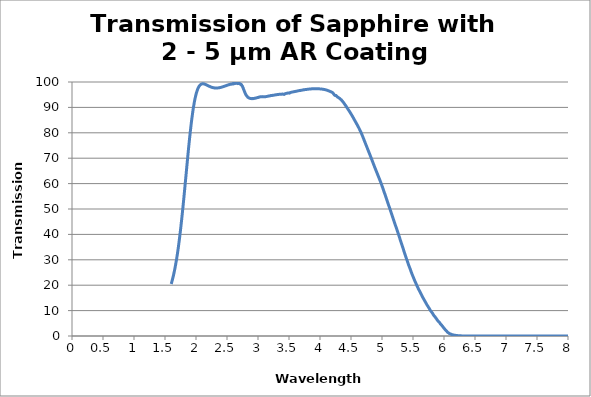
| Category | Series 0 |
|---|---|
| 1.59996 | 20.488 |
| 1.60243 | 20.683 |
| 1.6049 | 20.863 |
| 1.60737 | 21.093 |
| 1.6098299999999999 | 21.309 |
| 1.6122999999999998 | 21.516 |
| 1.61477 | 21.761 |
| 1.61724 | 21.986 |
| 1.61971 | 22.235 |
| 1.62218 | 22.436 |
| 1.6246500000000001 | 22.682 |
| 1.62712 | 22.929 |
| 1.6295899999999999 | 23.169 |
| 1.6320599999999998 | 23.408 |
| 1.63453 | 23.669 |
| 1.63699 | 23.946 |
| 1.6394600000000001 | 24.188 |
| 1.6419300000000001 | 24.481 |
| 1.6444 | 24.746 |
| 1.6468699999999998 | 25.047 |
| 1.64934 | 25.324 |
| 1.65181 | 25.603 |
| 1.65428 | 25.899 |
| 1.65675 | 26.192 |
| 1.65922 | 26.498 |
| 1.6616900000000001 | 26.842 |
| 1.66415 | 27.153 |
| 1.66662 | 27.469 |
| 1.66909 | 27.793 |
| 1.67156 | 28.134 |
| 1.67403 | 28.456 |
| 1.6765 | 28.811 |
| 1.67897 | 29.163 |
| 1.68144 | 29.519 |
| 1.68391 | 29.858 |
| 1.6863800000000002 | 30.214 |
| 1.68884 | 30.585 |
| 1.6913099999999999 | 30.97 |
| 1.69378 | 31.356 |
| 1.69625 | 31.742 |
| 1.69872 | 32.131 |
| 1.70119 | 32.531 |
| 1.7036600000000002 | 32.925 |
| 1.7061300000000001 | 33.328 |
| 1.7086 | 33.74 |
| 1.7110699999999999 | 34.159 |
| 1.71354 | 34.612 |
| 1.716 | 35.07 |
| 1.71847 | 35.521 |
| 1.7209400000000001 | 35.978 |
| 1.72341 | 36.444 |
| 1.72588 | 36.91 |
| 1.7283499999999998 | 37.38 |
| 1.73082 | 37.848 |
| 1.73329 | 38.338 |
| 1.73576 | 38.83 |
| 1.73823 | 39.326 |
| 1.7407000000000001 | 39.796 |
| 1.74316 | 40.311 |
| 1.74563 | 40.811 |
| 1.7481 | 41.289 |
| 1.75057 | 41.824 |
| 1.75304 | 42.356 |
| 1.75551 | 42.889 |
| 1.75798 | 43.442 |
| 1.76045 | 43.987 |
| 1.76292 | 44.551 |
| 1.76539 | 45.088 |
| 1.76786 | 45.641 |
| 1.77032 | 46.209 |
| 1.7727899999999999 | 46.784 |
| 1.77526 | 47.353 |
| 1.77773 | 47.937 |
| 1.7802 | 48.516 |
| 1.78267 | 49.112 |
| 1.7851400000000002 | 49.686 |
| 1.78761 | 50.284 |
| 1.79008 | 50.878 |
| 1.7925499999999999 | 51.484 |
| 1.79502 | 52.089 |
| 1.79748 | 52.718 |
| 1.79995 | 53.32 |
| 1.8024200000000001 | 53.931 |
| 1.80489 | 54.549 |
| 1.8073599999999999 | 55.177 |
| 1.8098299999999998 | 55.794 |
| 1.8123 | 56.43 |
| 1.81477 | 57.058 |
| 1.81724 | 57.692 |
| 1.81971 | 58.314 |
| 1.82217 | 58.956 |
| 1.82464 | 59.616 |
| 1.8271099999999998 | 60.246 |
| 1.82958 | 60.892 |
| 1.83205 | 61.526 |
| 1.83452 | 62.172 |
| 1.83699 | 62.791 |
| 1.83946 | 63.461 |
| 1.84193 | 64.08 |
| 1.8444 | 64.76 |
| 1.8468699999999998 | 65.365 |
| 1.84933 | 66.014 |
| 1.8518 | 66.687 |
| 1.85427 | 67.318 |
| 1.85674 | 67.945 |
| 1.85921 | 68.579 |
| 1.86168 | 69.238 |
| 1.8641500000000002 | 69.864 |
| 1.86662 | 70.504 |
| 1.86909 | 71.116 |
| 1.87156 | 71.715 |
| 1.8740299999999999 | 72.347 |
| 1.87649 | 72.969 |
| 1.87896 | 73.59 |
| 1.8814300000000002 | 74.205 |
| 1.8839000000000001 | 74.8 |
| 1.8863699999999999 | 75.415 |
| 1.8888399999999999 | 76.014 |
| 1.89131 | 76.581 |
| 1.89378 | 77.18 |
| 1.89625 | 77.754 |
| 1.89872 | 78.315 |
| 1.9011900000000002 | 78.883 |
| 1.90365 | 79.437 |
| 1.9061199999999998 | 79.97 |
| 1.90859 | 80.541 |
| 1.91106 | 81.087 |
| 1.91353 | 81.6 |
| 1.916 | 82.132 |
| 1.9184700000000001 | 82.656 |
| 1.92094 | 83.137 |
| 1.92341 | 83.673 |
| 1.92588 | 84.163 |
| 1.92834 | 84.638 |
| 1.93081 | 85.124 |
| 1.9332799999999999 | 85.599 |
| 1.93575 | 86.059 |
| 1.93822 | 86.508 |
| 1.94069 | 86.952 |
| 1.94316 | 87.394 |
| 1.9456300000000002 | 87.836 |
| 1.9481 | 88.267 |
| 1.95057 | 88.671 |
| 1.9530399999999999 | 89.079 |
| 1.9555 | 89.482 |
| 1.95797 | 89.866 |
| 1.96044 | 90.236 |
| 1.9629100000000002 | 90.616 |
| 1.9653800000000001 | 90.978 |
| 1.9678499999999999 | 91.314 |
| 1.9703199999999998 | 91.675 |
| 1.97279 | 91.997 |
| 1.97526 | 92.314 |
| 1.97773 | 92.632 |
| 1.9802 | 92.963 |
| 1.98266 | 93.249 |
| 1.98513 | 93.528 |
| 1.9875999999999998 | 93.803 |
| 1.99007 | 94.069 |
| 1.99254 | 94.34 |
| 1.99501 | 94.603 |
| 1.99748 | 94.845 |
| 1.9999500000000001 | 95.08 |
| 2.00242 | 95.323 |
| 2.00489 | 95.539 |
| 2.00736 | 95.752 |
| 2.00982 | 95.943 |
| 2.01229 | 96.141 |
| 2.01476 | 96.336 |
| 2.01723 | 96.522 |
| 2.0197 | 96.709 |
| 2.02217 | 96.885 |
| 2.02464 | 97.045 |
| 2.02711 | 97.19 |
| 2.0295799999999997 | 97.343 |
| 2.03205 | 97.484 |
| 2.03452 | 97.63 |
| 2.0369800000000002 | 97.741 |
| 2.03945 | 97.854 |
| 2.04192 | 97.974 |
| 2.04439 | 98.083 |
| 2.0468599999999997 | 98.195 |
| 2.04933 | 98.292 |
| 2.0518 | 98.368 |
| 2.05427 | 98.46 |
| 2.0567399999999996 | 98.555 |
| 2.05921 | 98.624 |
| 2.06167 | 98.69 |
| 2.06414 | 98.762 |
| 2.0666100000000003 | 98.82 |
| 2.06908 | 98.873 |
| 2.0715500000000002 | 98.926 |
| 2.07402 | 98.974 |
| 2.0764899999999997 | 99.028 |
| 2.07896 | 99.06 |
| 2.0814299999999997 | 99.101 |
| 2.0839000000000003 | 99.138 |
| 2.08637 | 99.157 |
| 2.0888299999999997 | 99.176 |
| 2.0913000000000004 | 99.205 |
| 2.09377 | 99.225 |
| 2.09624 | 99.244 |
| 2.09871 | 99.26 |
| 2.10118 | 99.269 |
| 2.10365 | 99.287 |
| 2.1061199999999998 | 99.291 |
| 2.10859 | 99.294 |
| 2.11106 | 99.285 |
| 2.1135300000000004 | 99.286 |
| 2.1159899999999996 | 99.278 |
| 2.1184600000000002 | 99.269 |
| 2.12093 | 99.272 |
| 2.1234 | 99.255 |
| 2.12587 | 99.255 |
| 2.12834 | 99.234 |
| 2.13081 | 99.223 |
| 2.13328 | 99.212 |
| 2.13575 | 99.194 |
| 2.13822 | 99.178 |
| 2.14069 | 99.153 |
| 2.14315 | 99.118 |
| 2.14562 | 99.099 |
| 2.1480900000000003 | 99.076 |
| 2.15056 | 99.068 |
| 2.15303 | 99.029 |
| 2.1555 | 99.01 |
| 2.1579699999999997 | 98.986 |
| 2.16044 | 98.961 |
| 2.1629099999999997 | 98.936 |
| 2.1653800000000003 | 98.907 |
| 2.16784 | 98.88 |
| 2.1703099999999997 | 98.841 |
| 2.1727800000000004 | 98.816 |
| 2.17525 | 98.788 |
| 2.17772 | 98.756 |
| 2.18019 | 98.715 |
| 2.18266 | 98.69 |
| 2.18513 | 98.66 |
| 2.1875999999999998 | 98.641 |
| 2.19007 | 98.609 |
| 2.19254 | 98.573 |
| 2.195 | 98.55 |
| 2.1974699999999996 | 98.519 |
| 2.1999400000000002 | 98.481 |
| 2.20241 | 98.451 |
| 2.20488 | 98.421 |
| 2.20735 | 98.393 |
| 2.20982 | 98.359 |
| 2.21229 | 98.339 |
| 2.21476 | 98.308 |
| 2.21723 | 98.275 |
| 2.2197 | 98.254 |
| 2.2221599999999997 | 98.228 |
| 2.2246300000000003 | 98.202 |
| 2.2271 | 98.176 |
| 2.2295700000000003 | 98.147 |
| 2.23204 | 98.116 |
| 2.23451 | 98.096 |
| 2.23698 | 98.07 |
| 2.2394499999999997 | 98.049 |
| 2.24192 | 98.031 |
| 2.2443899999999997 | 98.007 |
| 2.2468600000000003 | 97.982 |
| 2.24932 | 97.96 |
| 2.25179 | 97.941 |
| 2.2542600000000004 | 97.92 |
| 2.25673 | 97.905 |
| 2.2592 | 97.886 |
| 2.26167 | 97.864 |
| 2.26414 | 97.85 |
| 2.26661 | 97.832 |
| 2.2690799999999998 | 97.814 |
| 2.2715500000000004 | 97.806 |
| 2.27401 | 97.788 |
| 2.27648 | 97.766 |
| 2.27895 | 97.758 |
| 2.2814200000000002 | 97.748 |
| 2.28389 | 97.735 |
| 2.28636 | 97.724 |
| 2.28883 | 97.715 |
| 2.2913 | 97.711 |
| 2.29377 | 97.692 |
| 2.2962399999999996 | 97.681 |
| 2.2987100000000003 | 97.664 |
| 2.30117 | 97.66 |
| 2.3036399999999997 | 97.659 |
| 2.3061100000000003 | 97.656 |
| 2.30858 | 97.648 |
| 2.3110500000000003 | 97.65 |
| 2.31352 | 97.645 |
| 2.3159899999999998 | 97.642 |
| 2.31846 | 97.639 |
| 2.3209299999999997 | 97.636 |
| 2.3234 | 97.631 |
| 2.32587 | 97.632 |
| 2.32833 | 97.632 |
| 2.3308 | 97.629 |
| 2.33327 | 97.63 |
| 2.33574 | 97.636 |
| 2.33821 | 97.644 |
| 2.34068 | 97.653 |
| 2.34315 | 97.662 |
| 2.34562 | 97.659 |
| 2.34809 | 97.653 |
| 2.3505599999999998 | 97.664 |
| 2.3530300000000004 | 97.678 |
| 2.3554899999999996 | 97.68 |
| 2.35796 | 97.686 |
| 2.36043 | 97.692 |
| 2.3629000000000002 | 97.7 |
| 2.36537 | 97.701 |
| 2.36784 | 97.71 |
| 2.37031 | 97.721 |
| 2.37278 | 97.732 |
| 2.37525 | 97.741 |
| 2.3777199999999996 | 97.757 |
| 2.3801900000000002 | 97.77 |
| 2.38265 | 97.782 |
| 2.3851199999999997 | 97.795 |
| 2.3875900000000003 | 97.812 |
| 2.39006 | 97.826 |
| 2.3925300000000003 | 97.842 |
| 2.395 | 97.852 |
| 2.3974699999999998 | 97.864 |
| 2.39994 | 97.875 |
| 2.4024099999999997 | 97.89 |
| 2.40488 | 97.9 |
| 2.40734 | 97.916 |
| 2.40981 | 97.935 |
| 2.41228 | 97.959 |
| 2.41475 | 97.973 |
| 2.41722 | 97.988 |
| 2.41969 | 98.013 |
| 2.42216 | 98.026 |
| 2.42463 | 98.049 |
| 2.4271 | 98.077 |
| 2.42957 | 98.093 |
| 2.4320399999999998 | 98.114 |
| 2.4345 | 98.137 |
| 2.4369699999999996 | 98.149 |
| 2.4394400000000003 | 98.17 |
| 2.44191 | 98.184 |
| 2.44438 | 98.204 |
| 2.44685 | 98.229 |
| 2.44932 | 98.25 |
| 2.45179 | 98.268 |
| 2.45426 | 98.286 |
| 2.45673 | 98.308 |
| 2.4591999999999996 | 98.336 |
| 2.4616599999999997 | 98.36 |
| 2.46413 | 98.378 |
| 2.4666 | 98.406 |
| 2.4690700000000003 | 98.436 |
| 2.47154 | 98.453 |
| 2.4740100000000003 | 98.468 |
| 2.47648 | 98.5 |
| 2.4789499999999998 | 98.524 |
| 2.48142 | 98.533 |
| 2.4838899999999997 | 98.547 |
| 2.4863600000000003 | 98.568 |
| 2.48882 | 98.588 |
| 2.49129 | 98.606 |
| 2.4937600000000004 | 98.627 |
| 2.49623 | 98.654 |
| 2.4987 | 98.683 |
| 2.50117 | 98.707 |
| 2.50364 | 98.727 |
| 2.50611 | 98.751 |
| 2.50858 | 98.779 |
| 2.51105 | 98.802 |
| 2.51351 | 98.816 |
| 2.51598 | 98.825 |
| 2.5184499999999996 | 98.839 |
| 2.5209200000000003 | 98.871 |
| 2.52339 | 98.888 |
| 2.52586 | 98.905 |
| 2.52833 | 98.934 |
| 2.5308 | 98.946 |
| 2.53327 | 98.952 |
| 2.5357399999999997 | 98.974 |
| 2.53821 | 99.001 |
| 2.54067 | 99.042 |
| 2.5431399999999997 | 99.034 |
| 2.54561 | 99.043 |
| 2.54808 | 99.057 |
| 2.5505500000000003 | 99.07 |
| 2.55302 | 99.081 |
| 2.55549 | 99.139 |
| 2.55796 | 99.178 |
| 2.5604299999999998 | 99.133 |
| 2.5629 | 99.07 |
| 2.5653699999999997 | 99.127 |
| 2.56783 | 99.199 |
| 2.5703 | 99.197 |
| 2.57277 | 99.222 |
| 2.57524 | 99.208 |
| 2.57771 | 99.221 |
| 2.58018 | 99.264 |
| 2.58265 | 99.224 |
| 2.58512 | 99.203 |
| 2.58759 | 99.243 |
| 2.59006 | 99.292 |
| 2.59253 | 99.32 |
| 2.5949899999999997 | 99.178 |
| 2.59746 | 99.257 |
| 2.5999299999999996 | 99.407 |
| 2.6024000000000003 | 99.378 |
| 2.60487 | 99.3 |
| 2.60734 | 99.324 |
| 2.60981 | 99.391 |
| 2.61228 | 99.428 |
| 2.61475 | 99.428 |
| 2.6172199999999997 | 99.366 |
| 2.61969 | 99.376 |
| 2.62215 | 99.462 |
| 2.6246199999999997 | 99.53 |
| 2.62709 | 99.481 |
| 2.62956 | 99.435 |
| 2.6320300000000003 | 99.422 |
| 2.6345 | 99.507 |
| 2.63697 | 99.594 |
| 2.63944 | 99.624 |
| 2.6419099999999998 | 99.601 |
| 2.64438 | 99.6 |
| 2.64684 | 99.607 |
| 2.64931 | 99.637 |
| 2.65178 | 99.608 |
| 2.65425 | 99.567 |
| 2.65672 | 99.59 |
| 2.65919 | 99.587 |
| 2.66166 | 99.553 |
| 2.66413 | 99.512 |
| 2.6666 | 99.381 |
| 2.66907 | 99.396 |
| 2.67154 | 99.442 |
| 2.674 | 99.525 |
| 2.6764699999999997 | 99.481 |
| 2.67894 | 99.423 |
| 2.68141 | 99.502 |
| 2.6838800000000003 | 99.512 |
| 2.68635 | 99.483 |
| 2.68882 | 99.5 |
| 2.69129 | 99.516 |
| 2.69376 | 99.42 |
| 2.69623 | 99.354 |
| 2.6986999999999997 | 99.424 |
| 2.70116 | 99.412 |
| 2.70363 | 99.388 |
| 2.7060999999999997 | 99.376 |
| 2.7085700000000004 | 99.293 |
| 2.71104 | 99.193 |
| 2.7135100000000003 | 99.221 |
| 2.71598 | 99.232 |
| 2.71845 | 99.137 |
| 2.72092 | 98.987 |
| 2.7233899999999998 | 98.955 |
| 2.72586 | 98.954 |
| 2.72832 | 99.014 |
| 2.73079 | 99.031 |
| 2.73326 | 98.966 |
| 2.73573 | 98.835 |
| 2.7382 | 98.715 |
| 2.74067 | 98.494 |
| 2.74314 | 98.452 |
| 2.74561 | 98.468 |
| 2.74808 | 98.388 |
| 2.75055 | 98.264 |
| 2.75301 | 98.105 |
| 2.75548 | 97.874 |
| 2.7579499999999997 | 97.733 |
| 2.76042 | 97.675 |
| 2.76289 | 97.481 |
| 2.7653600000000003 | 97.272 |
| 2.76783 | 97.121 |
| 2.7703 | 96.959 |
| 2.77277 | 96.813 |
| 2.7752399999999997 | 96.701 |
| 2.77771 | 96.54 |
| 2.78017 | 96.356 |
| 2.78264 | 96.195 |
| 2.78511 | 96.066 |
| 2.7875799999999997 | 95.895 |
| 2.7900500000000004 | 95.77 |
| 2.79252 | 95.672 |
| 2.79499 | 95.529 |
| 2.79746 | 95.395 |
| 2.79993 | 95.286 |
| 2.8024 | 95.127 |
| 2.8048699999999998 | 94.964 |
| 2.80733 | 94.914 |
| 2.8098 | 94.851 |
| 2.81227 | 94.759 |
| 2.8147399999999996 | 94.66 |
| 2.81721 | 94.575 |
| 2.81968 | 94.5 |
| 2.82215 | 94.426 |
| 2.82462 | 94.356 |
| 2.82709 | 94.279 |
| 2.82956 | 94.195 |
| 2.83203 | 94.112 |
| 2.8344899999999997 | 94.032 |
| 2.83696 | 93.975 |
| 2.8394299999999997 | 93.925 |
| 2.8419 | 93.884 |
| 2.84437 | 93.861 |
| 2.8468400000000003 | 93.824 |
| 2.84931 | 93.768 |
| 2.85178 | 93.734 |
| 2.85425 | 93.717 |
| 2.8567199999999997 | 93.7 |
| 2.85918 | 93.68 |
| 2.86165 | 93.652 |
| 2.8641199999999998 | 93.624 |
| 2.86659 | 93.602 |
| 2.86906 | 93.577 |
| 2.8715300000000004 | 93.556 |
| 2.874 | 93.556 |
| 2.87647 | 93.546 |
| 2.87894 | 93.529 |
| 2.88141 | 93.536 |
| 2.88388 | 93.54 |
| 2.88634 | 93.511 |
| 2.88881 | 93.487 |
| 2.89128 | 93.478 |
| 2.89375 | 93.465 |
| 2.89622 | 93.458 |
| 2.89869 | 93.45 |
| 2.90116 | 93.438 |
| 2.90363 | 93.433 |
| 2.9061 | 93.448 |
| 2.90857 | 93.481 |
| 2.91104 | 93.503 |
| 2.9135 | 93.496 |
| 2.9159699999999997 | 93.483 |
| 2.91844 | 93.468 |
| 2.9209099999999997 | 93.454 |
| 2.9233800000000003 | 93.452 |
| 2.92585 | 93.461 |
| 2.9283200000000003 | 93.481 |
| 2.93079 | 93.505 |
| 2.93326 | 93.516 |
| 2.93573 | 93.517 |
| 2.9381999999999997 | 93.533 |
| 2.94066 | 93.56 |
| 2.94313 | 93.564 |
| 2.9455999999999998 | 93.566 |
| 2.94807 | 93.585 |
| 2.95054 | 93.591 |
| 2.9530100000000004 | 93.585 |
| 2.95548 | 93.596 |
| 2.95795 | 93.622 |
| 2.96042 | 93.644 |
| 2.96289 | 93.657 |
| 2.96536 | 93.686 |
| 2.96782 | 93.727 |
| 2.97029 | 93.74 |
| 2.97276 | 93.733 |
| 2.97523 | 93.738 |
| 2.9777 | 93.748 |
| 2.98017 | 93.758 |
| 2.98264 | 93.79 |
| 2.98511 | 93.819 |
| 2.98758 | 93.826 |
| 2.99005 | 93.846 |
| 2.9925100000000002 | 93.877 |
| 2.99498 | 93.9 |
| 2.9974499999999997 | 93.905 |
| 2.99992 | 93.902 |
| 3.0023899999999997 | 93.914 |
| 3.0048600000000003 | 93.945 |
| 3.00733 | 93.976 |
| 3.0098000000000003 | 93.988 |
| 3.01227 | 93.993 |
| 3.0147399999999998 | 94.006 |
| 3.01721 | 94.027 |
| 3.01967 | 94.059 |
| 3.02214 | 94.101 |
| 3.02461 | 94.13 |
| 3.0270799999999998 | 94.134 |
| 3.02955 | 94.125 |
| 3.03202 | 94.138 |
| 3.03449 | 94.166 |
| 3.03696 | 94.177 |
| 3.03943 | 94.168 |
| 3.0419 | 94.16 |
| 3.04437 | 94.166 |
| 3.04683 | 94.176 |
| 3.0493 | 94.185 |
| 3.05177 | 94.2 |
| 3.0542399999999996 | 94.223 |
| 3.05671 | 94.239 |
| 3.05918 | 94.236 |
| 3.06165 | 94.219 |
| 3.06412 | 94.209 |
| 3.06659 | 94.208 |
| 3.06906 | 94.215 |
| 3.07153 | 94.224 |
| 3.07399 | 94.224 |
| 3.07646 | 94.229 |
| 3.0789299999999997 | 94.242 |
| 3.0814 | 94.24 |
| 3.08387 | 94.224 |
| 3.0863400000000003 | 94.216 |
| 3.08881 | 94.221 |
| 3.0912800000000002 | 94.236 |
| 3.09375 | 94.236 |
| 3.0962199999999998 | 94.213 |
| 3.09868 | 94.195 |
| 3.10115 | 94.192 |
| 3.10362 | 94.198 |
| 3.10609 | 94.202 |
| 3.1085599999999998 | 94.203 |
| 3.1110300000000004 | 94.202 |
| 3.1135 | 94.202 |
| 3.11597 | 94.205 |
| 3.11844 | 94.212 |
| 3.12091 | 94.222 |
| 3.12338 | 94.231 |
| 3.12584 | 94.238 |
| 3.12831 | 94.246 |
| 3.13078 | 94.259 |
| 3.13325 | 94.278 |
| 3.1357199999999996 | 94.295 |
| 3.1381900000000003 | 94.305 |
| 3.14066 | 94.314 |
| 3.14313 | 94.324 |
| 3.1456 | 94.333 |
| 3.14807 | 94.344 |
| 3.15054 | 94.359 |
| 3.153 | 94.372 |
| 3.1554699999999998 | 94.381 |
| 3.15794 | 94.387 |
| 3.1604099999999997 | 94.397 |
| 3.16288 | 94.409 |
| 3.16535 | 94.422 |
| 3.1678200000000003 | 94.442 |
| 3.17029 | 94.47 |
| 3.1727600000000002 | 94.49 |
| 3.17523 | 94.489 |
| 3.1776999999999997 | 94.483 |
| 3.18016 | 94.489 |
| 3.18263 | 94.507 |
| 3.1851 | 94.531 |
| 3.18757 | 94.54 |
| 3.1900399999999998 | 94.539 |
| 3.1925100000000004 | 94.547 |
| 3.19498 | 94.564 |
| 3.19745 | 94.575 |
| 3.19992 | 94.587 |
| 3.20239 | 94.611 |
| 3.20485 | 94.643 |
| 3.20732 | 94.665 |
| 3.20979 | 94.671 |
| 3.21226 | 94.668 |
| 3.21473 | 94.669 |
| 3.2171999999999996 | 94.676 |
| 3.2196700000000003 | 94.68 |
| 3.22214 | 94.685 |
| 3.22461 | 94.698 |
| 3.22708 | 94.708 |
| 3.22955 | 94.708 |
| 3.2320100000000003 | 94.714 |
| 3.23448 | 94.733 |
| 3.2369499999999998 | 94.756 |
| 3.23942 | 94.773 |
| 3.2418899999999997 | 94.789 |
| 3.24436 | 94.802 |
| 3.24683 | 94.813 |
| 3.2493000000000003 | 94.815 |
| 3.25177 | 94.807 |
| 3.25424 | 94.802 |
| 3.25671 | 94.812 |
| 3.25917 | 94.832 |
| 3.26164 | 94.844 |
| 3.26411 | 94.846 |
| 3.26658 | 94.846 |
| 3.26905 | 94.856 |
| 3.2715199999999998 | 94.874 |
| 3.27399 | 94.89 |
| 3.27646 | 94.905 |
| 3.27893 | 94.918 |
| 3.2814 | 94.933 |
| 3.28387 | 94.955 |
| 3.28633 | 94.976 |
| 3.2888 | 94.981 |
| 3.29127 | 94.98 |
| 3.2937399999999997 | 94.989 |
| 3.29621 | 95.003 |
| 3.29868 | 95.008 |
| 3.3011500000000003 | 95.008 |
| 3.30362 | 95.013 |
| 3.30609 | 95.026 |
| 3.30856 | 95.037 |
| 3.31103 | 95.05 |
| 3.31349 | 95.07 |
| 3.31596 | 95.094 |
| 3.3184299999999998 | 95.105 |
| 3.3209 | 95.102 |
| 3.3233699999999997 | 95.093 |
| 3.3258400000000004 | 95.087 |
| 3.32831 | 95.091 |
| 3.3307800000000003 | 95.1 |
| 3.33325 | 95.112 |
| 3.33572 | 95.126 |
| 3.33818 | 95.138 |
| 3.34065 | 95.145 |
| 3.34312 | 95.148 |
| 3.34559 | 95.144 |
| 3.34806 | 95.142 |
| 3.35053 | 95.151 |
| 3.353 | 95.17 |
| 3.35547 | 95.188 |
| 3.35794 | 95.198 |
| 3.36041 | 95.201 |
| 3.36288 | 95.204 |
| 3.36534 | 95.202 |
| 3.36781 | 95.191 |
| 3.37028 | 95.177 |
| 3.37275 | 95.166 |
| 3.3752199999999997 | 95.16 |
| 3.37769 | 95.16 |
| 3.38016 | 95.17 |
| 3.3826300000000002 | 95.19 |
| 3.3851 | 95.218 |
| 3.38757 | 95.244 |
| 3.39004 | 95.264 |
| 3.3925 | 95.28 |
| 3.39497 | 95.29 |
| 3.39744 | 95.284 |
| 3.3999099999999998 | 95.262 |
| 3.40238 | 95.234 |
| 3.4048499999999997 | 95.211 |
| 3.4073200000000003 | 95.197 |
| 3.40979 | 95.186 |
| 3.4122600000000003 | 95.172 |
| 3.41473 | 95.148 |
| 3.4172 | 95.122 |
| 3.41966 | 95.109 |
| 3.42213 | 95.119 |
| 3.4246 | 95.151 |
| 3.42707 | 95.199 |
| 3.42954 | 95.253 |
| 3.43201 | 95.302 |
| 3.43448 | 95.338 |
| 3.43695 | 95.362 |
| 3.43942 | 95.381 |
| 3.44189 | 95.402 |
| 3.44435 | 95.425 |
| 3.44682 | 95.445 |
| 3.44929 | 95.464 |
| 3.45176 | 95.486 |
| 3.45423 | 95.503 |
| 3.4566999999999997 | 95.514 |
| 3.45917 | 95.524 |
| 3.46164 | 95.54 |
| 3.4641100000000002 | 95.556 |
| 3.46658 | 95.571 |
| 3.46905 | 95.584 |
| 3.4715100000000003 | 95.597 |
| 3.47398 | 95.613 |
| 3.47645 | 95.633 |
| 3.47892 | 95.653 |
| 3.4813899999999998 | 95.664 |
| 3.48386 | 95.663 |
| 3.4863299999999997 | 95.657 |
| 3.4888000000000003 | 95.653 |
| 3.49127 | 95.652 |
| 3.49374 | 95.652 |
| 3.49621 | 95.65 |
| 3.49867 | 95.638 |
| 3.50114 | 95.62 |
| 3.50361 | 95.607 |
| 3.50608 | 95.61 |
| 3.50855 | 95.636 |
| 3.51102 | 95.677 |
| 3.51349 | 95.721 |
| 3.51596 | 95.761 |
| 3.51843 | 95.802 |
| 3.5209 | 95.842 |
| 3.52337 | 95.872 |
| 3.52583 | 95.889 |
| 3.5283 | 95.9 |
| 3.53077 | 95.91 |
| 3.5332399999999997 | 95.923 |
| 3.53571 | 95.938 |
| 3.5381799999999997 | 95.955 |
| 3.5406500000000003 | 95.973 |
| 3.54312 | 95.988 |
| 3.5455900000000002 | 96.001 |
| 3.54806 | 96.015 |
| 3.55053 | 96.031 |
| 3.55299 | 96.049 |
| 3.55546 | 96.067 |
| 3.55793 | 96.083 |
| 3.5604 | 96.094 |
| 3.5628699999999998 | 96.102 |
| 3.56534 | 96.11 |
| 3.56781 | 96.122 |
| 3.5702800000000003 | 96.139 |
| 3.57275 | 96.158 |
| 3.57522 | 96.172 |
| 3.57768 | 96.179 |
| 3.58015 | 96.187 |
| 3.58262 | 96.197 |
| 3.58509 | 96.208 |
| 3.58756 | 96.217 |
| 3.59003 | 96.224 |
| 3.5925 | 96.23 |
| 3.59497 | 96.239 |
| 3.59744 | 96.25 |
| 3.59991 | 96.266 |
| 3.60238 | 96.284 |
| 3.6048400000000003 | 96.3 |
| 3.60731 | 96.31 |
| 3.60978 | 96.318 |
| 3.61225 | 96.326 |
| 3.6147199999999997 | 96.337 |
| 3.61719 | 96.351 |
| 3.6196599999999997 | 96.366 |
| 3.6221300000000003 | 96.38 |
| 3.6246 | 96.395 |
| 3.6270700000000002 | 96.41 |
| 3.62954 | 96.427 |
| 3.632 | 96.444 |
| 3.63447 | 96.461 |
| 3.63694 | 96.478 |
| 3.63941 | 96.492 |
| 3.64188 | 96.502 |
| 3.6443499999999998 | 96.509 |
| 3.64682 | 96.518 |
| 3.64929 | 96.531 |
| 3.6517600000000003 | 96.546 |
| 3.65423 | 96.558 |
| 3.6567 | 96.568 |
| 3.65916 | 96.578 |
| 3.66163 | 96.589 |
| 3.6641 | 96.602 |
| 3.66657 | 96.616 |
| 3.66904 | 96.629 |
| 3.67151 | 96.637 |
| 3.67398 | 96.642 |
| 3.67645 | 96.647 |
| 3.67892 | 96.654 |
| 3.68139 | 96.663 |
| 3.68385 | 96.674 |
| 3.6863200000000003 | 96.686 |
| 3.68879 | 96.699 |
| 3.69126 | 96.71 |
| 3.69373 | 96.719 |
| 3.6961999999999997 | 96.728 |
| 3.69867 | 96.74 |
| 3.7011399999999997 | 96.752 |
| 3.7036100000000003 | 96.763 |
| 3.70608 | 96.774 |
| 3.7085500000000002 | 96.788 |
| 3.7110100000000004 | 96.8 |
| 3.71348 | 96.81 |
| 3.71595 | 96.82 |
| 3.71842 | 96.83 |
| 3.72089 | 96.841 |
| 3.72336 | 96.854 |
| 3.7258299999999998 | 96.867 |
| 3.7283000000000004 | 96.882 |
| 3.73077 | 96.898 |
| 3.73324 | 96.914 |
| 3.73571 | 96.925 |
| 3.73817 | 96.933 |
| 3.74064 | 96.939 |
| 3.74311 | 96.947 |
| 3.74558 | 96.956 |
| 3.74805 | 96.965 |
| 3.75052 | 96.974 |
| 3.7529899999999996 | 96.983 |
| 3.7554600000000002 | 96.993 |
| 3.75793 | 97.001 |
| 3.7604 | 97.008 |
| 3.76287 | 97.014 |
| 3.76533 | 97.021 |
| 3.7678000000000003 | 97.029 |
| 3.77027 | 97.037 |
| 3.7727399999999998 | 97.043 |
| 3.77521 | 97.048 |
| 3.7776799999999997 | 97.055 |
| 3.78015 | 97.062 |
| 3.78262 | 97.071 |
| 3.7850900000000003 | 97.082 |
| 3.78756 | 97.095 |
| 3.79002 | 97.108 |
| 3.79249 | 97.117 |
| 3.79496 | 97.124 |
| 3.79743 | 97.128 |
| 3.7999 | 97.133 |
| 3.80237 | 97.141 |
| 3.80484 | 97.152 |
| 3.8073099999999998 | 97.163 |
| 3.8097800000000004 | 97.171 |
| 3.81225 | 97.177 |
| 3.81472 | 97.182 |
| 3.81718 | 97.19 |
| 3.81965 | 97.198 |
| 3.82212 | 97.205 |
| 3.82459 | 97.21 |
| 3.82706 | 97.215 |
| 3.82953 | 97.221 |
| 3.832 | 97.229 |
| 3.8344699999999996 | 97.236 |
| 3.8369400000000002 | 97.242 |
| 3.83941 | 97.247 |
| 3.84188 | 97.253 |
| 3.8443400000000003 | 97.26 |
| 3.84681 | 97.266 |
| 3.8492800000000003 | 97.272 |
| 3.85175 | 97.278 |
| 3.8542199999999998 | 97.282 |
| 3.85669 | 97.286 |
| 3.8591599999999997 | 97.29 |
| 3.86163 | 97.294 |
| 3.8641 | 97.298 |
| 3.8665700000000003 | 97.303 |
| 3.86904 | 97.307 |
| 3.8715 | 97.311 |
| 3.87397 | 97.313 |
| 3.87644 | 97.315 |
| 3.87891 | 97.317 |
| 3.88138 | 97.321 |
| 3.88385 | 97.324 |
| 3.88632 | 97.326 |
| 3.8887899999999997 | 97.328 |
| 3.8912600000000004 | 97.33 |
| 3.89373 | 97.333 |
| 3.8962 | 97.337 |
| 3.89866 | 97.34 |
| 3.90113 | 97.341 |
| 3.9036 | 97.342 |
| 3.90607 | 97.345 |
| 3.90854 | 97.348 |
| 3.91101 | 97.352 |
| 3.91348 | 97.357 |
| 3.9159499999999996 | 97.361 |
| 3.9184200000000002 | 97.364 |
| 3.92089 | 97.365 |
| 3.92335 | 97.366 |
| 3.9258200000000003 | 97.367 |
| 3.92829 | 97.369 |
| 3.9307600000000003 | 97.37 |
| 3.93323 | 97.37 |
| 3.9356999999999998 | 97.37 |
| 3.93817 | 97.37 |
| 3.9406399999999997 | 97.37 |
| 3.9431100000000003 | 97.37 |
| 3.94558 | 97.368 |
| 3.9480500000000003 | 97.366 |
| 3.9505100000000004 | 97.365 |
| 3.95298 | 97.364 |
| 3.95545 | 97.362 |
| 3.95792 | 97.36 |
| 3.96039 | 97.357 |
| 3.96286 | 97.354 |
| 3.96533 | 97.35 |
| 3.9678 | 97.347 |
| 3.97027 | 97.344 |
| 3.97274 | 97.339 |
| 3.97521 | 97.334 |
| 3.9776700000000003 | 97.328 |
| 3.98014 | 97.322 |
| 3.98261 | 97.318 |
| 3.98508 | 97.314 |
| 3.98755 | 97.31 |
| 3.99002 | 97.304 |
| 3.9924899999999997 | 97.299 |
| 3.99496 | 97.295 |
| 3.99743 | 97.29 |
| 3.9999000000000002 | 97.285 |
| 4.00237 | 97.28 |
| 4.00483 | 97.275 |
| 4.0073 | 97.268 |
| 4.00977 | 97.262 |
| 4.012239999999999 | 97.255 |
| 4.01471 | 97.248 |
| 4.01718 | 97.242 |
| 4.01965 | 97.236 |
| 4.02212 | 97.229 |
| 4.02459 | 97.22 |
| 4.02706 | 97.212 |
| 4.02952 | 97.205 |
| 4.0319899999999995 | 97.197 |
| 4.03446 | 97.19 |
| 4.03693 | 97.184 |
| 4.0394 | 97.176 |
| 4.04187 | 97.168 |
| 4.04434 | 97.158 |
| 4.04681 | 97.148 |
| 4.04928 | 97.137 |
| 4.05175 | 97.127 |
| 4.05422 | 97.118 |
| 4.05668 | 97.108 |
| 4.05915 | 97.099 |
| 4.06162 | 97.088 |
| 4.06409 | 97.076 |
| 4.06656 | 97.064 |
| 4.069030000000001 | 97.052 |
| 4.0715 | 97.04 |
| 4.07397 | 97.028 |
| 4.07644 | 97.014 |
| 4.07891 | 97.001 |
| 4.08138 | 96.988 |
| 4.08384 | 96.973 |
| 4.08631 | 96.957 |
| 4.08878 | 96.94 |
| 4.09125 | 96.923 |
| 4.093719999999999 | 96.906 |
| 4.09619 | 96.888 |
| 4.09866 | 96.87 |
| 4.10113 | 96.851 |
| 4.1036 | 96.832 |
| 4.10607 | 96.813 |
| 4.10854 | 96.794 |
| 4.111 | 96.775 |
| 4.11347 | 96.756 |
| 4.115939999999999 | 96.736 |
| 4.11841 | 96.716 |
| 4.1208800000000005 | 96.693 |
| 4.12335 | 96.67 |
| 4.12582 | 96.646 |
| 4.12829 | 96.622 |
| 4.13076 | 96.6 |
| 4.133229999999999 | 96.578 |
| 4.135689999999999 | 96.555 |
| 4.13816 | 96.531 |
| 4.14063 | 96.506 |
| 4.1431000000000004 | 96.481 |
| 4.145569999999999 | 96.457 |
| 4.14804 | 96.433 |
| 4.150510000000001 | 96.409 |
| 4.1529799999999994 | 96.385 |
| 4.15545 | 96.361 |
| 4.15792 | 96.337 |
| 4.1603900000000005 | 96.312 |
| 4.162850000000001 | 96.286 |
| 4.1653199999999995 | 96.259 |
| 4.16779 | 96.233 |
| 4.17026 | 96.207 |
| 4.17273 | 96.18 |
| 4.1752 | 96.152 |
| 4.17767 | 96.124 |
| 4.180140000000001 | 96.095 |
| 4.1826099999999995 | 96.067 |
| 4.18508 | 96.038 |
| 4.18755 | 96.009 |
| 4.19001 | 95.979 |
| 4.19248 | 95.948 |
| 4.1949499999999995 | 95.915 |
| 4.19742 | 95.88 |
| 4.19989 | 95.841 |
| 4.20236 | 95.798 |
| 4.20483 | 95.748 |
| 4.2073 | 95.69 |
| 4.209770000000001 | 95.627 |
| 4.2122399999999995 | 95.558 |
| 4.21471 | 95.487 |
| 4.21717 | 95.412 |
| 4.21964 | 95.334 |
| 4.22211 | 95.246 |
| 4.22458 | 95.152 |
| 4.22705 | 95.058 |
| 4.229520000000001 | 94.967 |
| 4.23199 | 94.895 |
| 4.23446 | 94.834 |
| 4.23693 | 94.785 |
| 4.2394 | 94.75 |
| 4.24187 | 94.728 |
| 4.24433 | 94.716 |
| 4.2468 | 94.713 |
| 4.24927 | 94.717 |
| 4.25174 | 94.722 |
| 4.25421 | 94.724 |
| 4.25668 | 94.716 |
| 4.25915 | 94.687 |
| 4.26162 | 94.639 |
| 4.26409 | 94.565 |
| 4.26656 | 94.474 |
| 4.26902 | 94.39 |
| 4.27149 | 94.317 |
| 4.27396 | 94.265 |
| 4.27643 | 94.216 |
| 4.278899999999999 | 94.168 |
| 4.28137 | 94.118 |
| 4.2838400000000005 | 94.069 |
| 4.28631 | 94.023 |
| 4.28878 | 93.983 |
| 4.29125 | 93.95 |
| 4.29372 | 93.919 |
| 4.2961800000000006 | 93.888 |
| 4.298649999999999 | 93.85 |
| 4.30112 | 93.809 |
| 4.30359 | 93.766 |
| 4.30606 | 93.722 |
| 4.308529999999999 | 93.68 |
| 4.311 | 93.639 |
| 4.313470000000001 | 93.601 |
| 4.315939999999999 | 93.564 |
| 4.31841 | 93.525 |
| 4.32088 | 93.482 |
| 4.32334 | 93.43 |
| 4.325810000000001 | 93.373 |
| 4.3282799999999995 | 93.31 |
| 4.33075 | 93.247 |
| 4.33322 | 93.187 |
| 4.33569 | 93.13 |
| 4.33816 | 93.077 |
| 4.34063 | 93.023 |
| 4.343100000000001 | 92.967 |
| 4.3455699999999995 | 92.904 |
| 4.34804 | 92.838 |
| 4.3505 | 92.768 |
| 4.35297 | 92.696 |
| 4.35544 | 92.624 |
| 4.3579099999999995 | 92.552 |
| 4.36038 | 92.481 |
| 4.362850000000001 | 92.409 |
| 4.36532 | 92.338 |
| 4.36779 | 92.265 |
| 4.37026 | 92.19 |
| 4.37273 | 92.114 |
| 4.37519 | 92.036 |
| 4.37766 | 91.958 |
| 4.38013 | 91.879 |
| 4.3826 | 91.799 |
| 4.38507 | 91.718 |
| 4.3875399999999996 | 91.636 |
| 4.39001 | 91.551 |
| 4.39248 | 91.466 |
| 4.39495 | 91.379 |
| 4.39742 | 91.293 |
| 4.39989 | 91.206 |
| 4.40235 | 91.119 |
| 4.40482 | 91.031 |
| 4.40729 | 90.942 |
| 4.40976 | 90.852 |
| 4.412229999999999 | 90.76 |
| 4.4147 | 90.669 |
| 4.4171700000000005 | 90.578 |
| 4.41964 | 90.488 |
| 4.42211 | 90.399 |
| 4.42458 | 90.309 |
| 4.42705 | 90.217 |
| 4.4295100000000005 | 90.124 |
| 4.431979999999999 | 90.032 |
| 4.43445 | 89.94 |
| 4.43692 | 89.849 |
| 4.43939 | 89.758 |
| 4.441859999999999 | 89.667 |
| 4.44433 | 89.575 |
| 4.4468000000000005 | 89.482 |
| 4.44927 | 89.387 |
| 4.45174 | 89.293 |
| 4.45421 | 89.2 |
| 4.45667 | 89.108 |
| 4.4591400000000005 | 89.017 |
| 4.461609999999999 | 88.924 |
| 4.46408 | 88.831 |
| 4.46655 | 88.737 |
| 4.46902 | 88.644 |
| 4.47149 | 88.552 |
| 4.47396 | 88.462 |
| 4.476430000000001 | 88.371 |
| 4.478899999999999 | 88.279 |
| 4.48137 | 88.186 |
| 4.48383 | 88.092 |
| 4.4863 | 87.998 |
| 4.488770000000001 | 87.901 |
| 4.4912399999999995 | 87.804 |
| 4.49371 | 87.706 |
| 4.496180000000001 | 87.608 |
| 4.49865 | 87.51 |
| 4.50112 | 87.412 |
| 4.50359 | 87.313 |
| 4.506060000000001 | 87.213 |
| 4.508520000000001 | 87.112 |
| 4.51099 | 87.009 |
| 4.51346 | 86.907 |
| 4.51593 | 86.805 |
| 4.5184 | 86.703 |
| 4.5208699999999995 | 86.601 |
| 4.52334 | 86.498 |
| 4.525810000000001 | 86.395 |
| 4.52828 | 86.29 |
| 4.53075 | 86.183 |
| 4.53322 | 86.076 |
| 4.53568 | 85.967 |
| 4.53815 | 85.858 |
| 4.54062 | 85.749 |
| 4.54309 | 85.64 |
| 4.54556 | 85.53 |
| 4.54803 | 85.419 |
| 4.5505 | 85.308 |
| 4.55297 | 85.198 |
| 4.55544 | 85.088 |
| 4.55791 | 84.979 |
| 4.56038 | 84.87 |
| 4.5628400000000005 | 84.761 |
| 4.56531 | 84.652 |
| 4.56778 | 84.544 |
| 4.57025 | 84.436 |
| 4.57272 | 84.329 |
| 4.575189999999999 | 84.222 |
| 4.57766 | 84.115 |
| 4.5801300000000005 | 84.008 |
| 4.5826 | 83.9 |
| 4.58507 | 83.792 |
| 4.58754 | 83.682 |
| 4.59 | 83.573 |
| 4.5924700000000005 | 83.464 |
| 4.594939999999999 | 83.355 |
| 4.59741 | 83.247 |
| 4.59988 | 83.138 |
| 4.60235 | 83.028 |
| 4.60482 | 82.918 |
| 4.60729 | 82.807 |
| 4.6097600000000005 | 82.695 |
| 4.612229999999999 | 82.582 |
| 4.6146899999999995 | 82.469 |
| 4.61716 | 82.355 |
| 4.61963 | 82.239 |
| 4.6221000000000005 | 82.123 |
| 4.624569999999999 | 82.005 |
| 4.62704 | 81.886 |
| 4.62951 | 81.766 |
| 4.6319799999999995 | 81.645 |
| 4.63445 | 81.524 |
| 4.63692 | 81.401 |
| 4.639390000000001 | 81.278 |
| 4.641850000000001 | 81.155 |
| 4.64432 | 81.03 |
| 4.64679 | 80.905 |
| 4.64926 | 80.778 |
| 4.65173 | 80.65 |
| 4.6541999999999994 | 80.52 |
| 4.65667 | 80.388 |
| 4.659140000000001 | 80.256 |
| 4.66161 | 80.122 |
| 4.66408 | 79.988 |
| 4.66655 | 79.853 |
| 4.66901 | 79.716 |
| 4.67148 | 79.577 |
| 4.67395 | 79.434 |
| 4.67642 | 79.29 |
| 4.67889 | 79.143 |
| 4.68136 | 78.995 |
| 4.6838299999999995 | 78.846 |
| 4.6863 | 78.697 |
| 4.688770000000001 | 78.547 |
| 4.69124 | 78.397 |
| 4.69371 | 78.247 |
| 4.69617 | 78.095 |
| 4.69864 | 77.942 |
| 4.70111 | 77.788 |
| 4.70358 | 77.634 |
| 4.70605 | 77.479 |
| 4.70852 | 77.325 |
| 4.71099 | 77.17 |
| 4.71346 | 77.016 |
| 4.71593 | 76.861 |
| 4.7184 | 76.706 |
| 4.72086 | 76.552 |
| 4.72333 | 76.398 |
| 4.7258000000000004 | 76.243 |
| 4.72827 | 76.089 |
| 4.73074 | 75.934 |
| 4.73321 | 75.78 |
| 4.73568 | 75.627 |
| 4.738149999999999 | 75.475 |
| 4.74062 | 75.323 |
| 4.7430900000000005 | 75.173 |
| 4.74556 | 75.023 |
| 4.74802 | 74.874 |
| 4.75049 | 74.724 |
| 4.75296 | 74.574 |
| 4.7554300000000005 | 74.423 |
| 4.757899999999999 | 74.271 |
| 4.76037 | 74.12 |
| 4.76284 | 73.967 |
| 4.76531 | 73.815 |
| 4.76778 | 73.662 |
| 4.77025 | 73.508 |
| 4.7727200000000005 | 73.355 |
| 4.775180000000001 | 73.203 |
| 4.7776499999999995 | 73.051 |
| 4.78012 | 72.9 |
| 4.78259 | 72.749 |
| 4.7850600000000005 | 72.597 |
| 4.787529999999999 | 72.446 |
| 4.79 | 72.294 |
| 4.792470000000001 | 72.143 |
| 4.7949399999999995 | 71.991 |
| 4.79741 | 71.84 |
| 4.79988 | 71.688 |
| 4.80234 | 71.535 |
| 4.804810000000001 | 71.383 |
| 4.8072799999999996 | 71.229 |
| 4.80975 | 71.074 |
| 4.81222 | 70.918 |
| 4.81469 | 70.761 |
| 4.817159999999999 | 70.604 |
| 4.81963 | 70.446 |
| 4.822100000000001 | 70.29 |
| 4.82457 | 70.133 |
| 4.82704 | 69.978 |
| 4.8295 | 69.823 |
| 4.83197 | 69.669 |
| 4.83444 | 69.515 |
| 4.83691 | 69.36 |
| 4.83938 | 69.202 |
| 4.84185 | 69.044 |
| 4.84432 | 68.885 |
| 4.84679 | 68.725 |
| 4.84926 | 68.567 |
| 4.85173 | 68.408 |
| 4.85419 | 68.25 |
| 4.85666 | 68.092 |
| 4.85913 | 67.934 |
| 4.8616 | 67.776 |
| 4.86407 | 67.618 |
| 4.86654 | 67.461 |
| 4.86901 | 67.305 |
| 4.871479999999999 | 67.151 |
| 4.87395 | 66.997 |
| 4.87642 | 66.844 |
| 4.87889 | 66.69 |
| 4.88135 | 66.537 |
| 4.88382 | 66.384 |
| 4.88629 | 66.232 |
| 4.88876 | 66.079 |
| 4.891229999999999 | 65.927 |
| 4.8937 | 65.774 |
| 4.89617 | 65.621 |
| 4.89864 | 65.468 |
| 4.90111 | 65.314 |
| 4.90358 | 65.163 |
| 4.9060500000000005 | 65.012 |
| 4.908510000000001 | 64.862 |
| 4.9109799999999995 | 64.712 |
| 4.91345 | 64.562 |
| 4.91592 | 64.412 |
| 4.9183900000000005 | 64.26 |
| 4.920859999999999 | 64.11 |
| 4.92333 | 63.959 |
| 4.925800000000001 | 63.809 |
| 4.92827 | 63.658 |
| 4.93074 | 63.508 |
| 4.93321 | 63.358 |
| 4.93567 | 63.207 |
| 4.938140000000001 | 63.057 |
| 4.9406099999999995 | 62.907 |
| 4.94308 | 62.757 |
| 4.94555 | 62.607 |
| 4.9480200000000005 | 62.457 |
| 4.950489999999999 | 62.306 |
| 4.95296 | 62.155 |
| 4.955430000000001 | 62.001 |
| 4.9578999999999995 | 61.847 |
| 4.96036 | 61.692 |
| 4.96283 | 61.538 |
| 4.9653 | 61.384 |
| 4.967770000000001 | 61.23 |
| 4.9702399999999995 | 61.075 |
| 4.97271 | 60.92 |
| 4.97518 | 60.763 |
| 4.97765 | 60.605 |
| 4.98012 | 60.446 |
| 4.98259 | 60.286 |
| 4.985060000000001 | 60.125 |
| 4.987520000000001 | 59.963 |
| 4.98999 | 59.8 |
| 4.99246 | 59.636 |
| 4.99493 | 59.47 |
| 4.9974 | 59.302 |
| 4.99987 | 59.134 |
| 5.00234 | 58.964 |
| 5.00481 | 58.794 |
| 5.00728 | 58.624 |
| 5.00975 | 58.454 |
| 5.01222 | 58.283 |
| 5.01468 | 58.111 |
| 5.01715 | 57.934 |
| 5.01962 | 57.756 |
| 5.02209 | 57.578 |
| 5.02456 | 57.399 |
| 5.02703 | 57.224 |
| 5.0295 | 57.05 |
| 5.03197 | 56.878 |
| 5.03444 | 56.707 |
| 5.03691 | 56.534 |
| 5.03938 | 56.362 |
| 5.0418400000000005 | 56.187 |
| 5.04431 | 56.012 |
| 5.04678 | 55.836 |
| 5.04925 | 55.659 |
| 5.05172 | 55.482 |
| 5.054189999999999 | 55.305 |
| 5.05666 | 55.128 |
| 5.05913 | 54.95 |
| 5.0616 | 54.773 |
| 5.06407 | 54.596 |
| 5.066529999999999 | 54.419 |
| 5.069 | 54.241 |
| 5.071470000000001 | 54.064 |
| 5.0739399999999995 | 53.886 |
| 5.07641 | 53.706 |
| 5.07888 | 53.526 |
| 5.0813500000000005 | 53.343 |
| 5.083819999999999 | 53.16 |
| 5.08629 | 52.98 |
| 5.088760000000001 | 52.799 |
| 5.0912299999999995 | 52.624 |
| 5.09369 | 52.449 |
| 5.09616 | 52.274 |
| 5.09863 | 52.1 |
| 5.101100000000001 | 51.924 |
| 5.1035699999999995 | 51.748 |
| 5.10604 | 51.572 |
| 5.10851 | 51.395 |
| 5.11098 | 51.219 |
| 5.113449999999999 | 51.042 |
| 5.11592 | 50.866 |
| 5.118390000000001 | 50.689 |
| 5.120850000000001 | 50.513 |
| 5.12332 | 50.338 |
| 5.12579 | 50.163 |
| 5.12826 | 49.988 |
| 5.13073 | 49.812 |
| 5.1331999999999995 | 49.637 |
| 5.13567 | 49.461 |
| 5.13814 | 49.285 |
| 5.14061 | 49.106 |
| 5.14308 | 48.925 |
| 5.14555 | 48.74 |
| 5.14801 | 48.553 |
| 5.15048 | 48.368 |
| 5.15295 | 48.186 |
| 5.15542 | 48.007 |
| 5.15789 | 47.833 |
| 5.16036 | 47.659 |
| 5.16283 | 47.485 |
| 5.1653 | 47.309 |
| 5.167770000000001 | 47.129 |
| 5.17024 | 46.949 |
| 5.17271 | 46.767 |
| 5.1751700000000005 | 46.586 |
| 5.17764 | 46.405 |
| 5.18011 | 46.224 |
| 5.18258 | 46.045 |
| 5.18505 | 45.866 |
| 5.18752 | 45.689 |
| 5.18999 | 45.513 |
| 5.19246 | 45.335 |
| 5.19493 | 45.156 |
| 5.1974 | 44.976 |
| 5.199859999999999 | 44.795 |
| 5.20233 | 44.615 |
| 5.2048000000000005 | 44.436 |
| 5.20727 | 44.258 |
| 5.20974 | 44.08 |
| 5.21221 | 43.9 |
| 5.21468 | 43.719 |
| 5.217149999999999 | 43.538 |
| 5.21962 | 43.362 |
| 5.222090000000001 | 43.187 |
| 5.22456 | 43.018 |
| 5.22702 | 42.85 |
| 5.22949 | 42.678 |
| 5.23196 | 42.504 |
| 5.234430000000001 | 42.324 |
| 5.2368999999999994 | 42.141 |
| 5.23937 | 41.958 |
| 5.24184 | 41.774 |
| 5.2443100000000005 | 41.593 |
| 5.246779999999999 | 41.415 |
| 5.24925 | 41.237 |
| 5.251720000000001 | 41.06 |
| 5.25418 | 40.883 |
| 5.25665 | 40.704 |
| 5.25912 | 40.524 |
| 5.26159 | 40.343 |
| 5.264060000000001 | 40.161 |
| 5.2665299999999995 | 39.978 |
| 5.269 | 39.794 |
| 5.27147 | 39.607 |
| 5.27394 | 39.419 |
| 5.27641 | 39.231 |
| 5.27888 | 39.045 |
| 5.28134 | 38.859 |
| 5.283810000000001 | 38.676 |
| 5.28628 | 38.492 |
| 5.28875 | 38.303 |
| 5.29122 | 38.114 |
| 5.29369 | 37.92 |
| 5.2961599999999995 | 37.727 |
| 5.29863 | 37.54 |
| 5.3011 | 37.355 |
| 5.30357 | 37.173 |
| 5.30603 | 36.993 |
| 5.3085 | 36.813 |
| 5.31097 | 36.631 |
| 5.31344 | 36.449 |
| 5.31591 | 36.266 |
| 5.31838 | 36.083 |
| 5.32085 | 35.898 |
| 5.32332 | 35.713 |
| 5.32579 | 35.527 |
| 5.32826 | 35.342 |
| 5.33073 | 35.159 |
| 5.333189999999999 | 34.977 |
| 5.33566 | 34.797 |
| 5.3381300000000005 | 34.622 |
| 5.3406 | 34.445 |
| 5.34307 | 34.262 |
| 5.34554 | 34.079 |
| 5.34801 | 33.877 |
| 5.350479999999999 | 33.673 |
| 5.35295 | 33.468 |
| 5.3554200000000005 | 33.263 |
| 5.35789 | 33.068 |
| 5.36035 | 32.888 |
| 5.36282 | 32.71 |
| 5.36529 | 32.541 |
| 5.3677600000000005 | 32.373 |
| 5.370229999999999 | 32.2 |
| 5.3727 | 32.026 |
| 5.37517 | 31.848 |
| 5.37764 | 31.668 |
| 5.380109999999999 | 31.488 |
| 5.38258 | 31.307 |
| 5.385050000000001 | 31.128 |
| 5.38751 | 30.95 |
| 5.3899799999999995 | 30.772 |
| 5.39245 | 30.597 |
| 5.39492 | 30.422 |
| 5.397390000000001 | 30.249 |
| 5.399859999999999 | 30.078 |
| 5.40233 | 29.908 |
| 5.4048 | 29.74 |
| 5.4072700000000005 | 29.572 |
| 5.40974 | 29.406 |
| 5.41221 | 29.24 |
| 5.41467 | 29.065 |
| 5.417140000000001 | 28.888 |
| 5.41961 | 28.704 |
| 5.42208 | 28.511 |
| 5.42455 | 28.321 |
| 5.427020000000001 | 28.141 |
| 5.4294899999999995 | 27.962 |
| 5.43196 | 27.802 |
| 5.43443 | 27.645 |
| 5.4369 | 27.489 |
| 5.43936 | 27.333 |
| 5.4418299999999995 | 27.176 |
| 5.4443 | 27.014 |
| 5.446770000000001 | 26.853 |
| 5.44924 | 26.695 |
| 5.45171 | 26.538 |
| 5.45418 | 26.381 |
| 5.45665 | 26.224 |
| 5.4591199999999995 | 26.064 |
| 5.46159 | 25.893 |
| 5.464060000000001 | 25.722 |
| 5.46652 | 25.547 |
| 5.46899 | 25.372 |
| 5.47146 | 25.204 |
| 5.47393 | 25.04 |
| 5.4764 | 24.878 |
| 5.47887 | 24.719 |
| 5.48134 | 24.559 |
| 5.48381 | 24.404 |
| 5.48628 | 24.248 |
| 5.48875 | 24.098 |
| 5.49122 | 23.951 |
| 5.49368 | 23.804 |
| 5.496149999999999 | 23.658 |
| 5.49862 | 23.512 |
| 5.5010900000000005 | 23.363 |
| 5.50356 | 23.215 |
| 5.50603 | 23.068 |
| 5.5085 | 22.923 |
| 5.51097 | 22.778 |
| 5.513439999999999 | 22.634 |
| 5.51591 | 22.491 |
| 5.5183800000000005 | 22.343 |
| 5.52084 | 22.194 |
| 5.52331 | 22.045 |
| 5.52578 | 21.897 |
| 5.52825 | 21.749 |
| 5.5307200000000005 | 21.611 |
| 5.533189999999999 | 21.472 |
| 5.53566 | 21.34 |
| 5.53813 | 21.21 |
| 5.5406 | 21.08 |
| 5.543069999999999 | 20.948 |
| 5.545529999999999 | 20.817 |
| 5.548 | 20.679 |
| 5.550470000000001 | 20.54 |
| 5.5529399999999995 | 20.399 |
| 5.55541 | 20.257 |
| 5.55788 | 20.115 |
| 5.560350000000001 | 19.985 |
| 5.562819999999999 | 19.854 |
| 5.56529 | 19.729 |
| 5.56776 | 19.609 |
| 5.57023 | 19.486 |
| 5.57269 | 19.357 |
| 5.5751599999999994 | 19.227 |
| 5.57763 | 19.086 |
| 5.580100000000001 | 18.942 |
| 5.58257 | 18.801 |
| 5.58504 | 18.669 |
| 5.58751 | 18.536 |
| 5.58998 | 18.423 |
| 5.5924499999999995 | 18.311 |
| 5.59492 | 18.2 |
| 5.597390000000001 | 18.09 |
| 5.59985 | 17.979 |
| 5.60232 | 17.86 |
| 5.60479 | 17.74 |
| 5.60726 | 17.62 |
| 5.60973 | 17.497 |
| 5.6122 | 17.375 |
| 5.61467 | 17.254 |
| 5.61714 | 17.132 |
| 5.61961 | 17.015 |
| 5.6220799999999995 | 16.901 |
| 5.62455 | 16.788 |
| 5.62701 | 16.683 |
| 5.629479999999999 | 16.578 |
| 5.63195 | 16.47 |
| 5.63442 | 16.36 |
| 5.63689 | 16.246 |
| 5.63936 | 16.116 |
| 5.64183 | 15.986 |
| 5.6443 | 15.852 |
| 5.64677 | 15.718 |
| 5.64924 | 15.589 |
| 5.6517 | 15.472 |
| 5.65417 | 15.356 |
| 5.65664 | 15.249 |
| 5.65911 | 15.146 |
| 5.66158 | 15.044 |
| 5.6640500000000005 | 14.944 |
| 5.66652 | 14.845 |
| 5.66899 | 14.74 |
| 5.67146 | 14.632 |
| 5.67393 | 14.523 |
| 5.676399999999999 | 14.406 |
| 5.678859999999999 | 14.29 |
| 5.68133 | 14.177 |
| 5.6838 | 14.064 |
| 5.68627 | 13.953 |
| 5.68874 | 13.846 |
| 5.69121 | 13.739 |
| 5.6936800000000005 | 13.634 |
| 5.696149999999999 | 13.532 |
| 5.69862 | 13.43 |
| 5.70109 | 13.333 |
| 5.70356 | 13.235 |
| 5.7060200000000005 | 13.133 |
| 5.708489999999999 | 13.026 |
| 5.71096 | 12.919 |
| 5.713430000000001 | 12.798 |
| 5.7158999999999995 | 12.678 |
| 5.71837 | 12.562 |
| 5.72084 | 12.45 |
| 5.723310000000001 | 12.339 |
| 5.725779999999999 | 12.241 |
| 5.72825 | 12.144 |
| 5.73072 | 12.049 |
| 5.73318 | 11.957 |
| 5.73565 | 11.865 |
| 5.73812 | 11.77 |
| 5.74059 | 11.675 |
| 5.743060000000001 | 11.579 |
| 5.74553 | 11.481 |
| 5.748 | 11.383 |
| 5.75047 | 11.29 |
| 5.75294 | 11.201 |
| 5.7554099999999995 | 11.112 |
| 5.75788 | 11.022 |
| 5.76034 | 10.932 |
| 5.76281 | 10.832 |
| 5.76528 | 10.72 |
| 5.76775 | 10.608 |
| 5.77022 | 10.494 |
| 5.77269 | 10.38 |
| 5.77516 | 10.273 |
| 5.77763 | 10.182 |
| 5.7801 | 10.092 |
| 5.78257 | 10.008 |
| 5.78503 | 9.927 |
| 5.7875 | 9.846 |
| 5.78997 | 9.765 |
| 5.79244 | 9.683 |
| 5.79491 | 9.601 |
| 5.79738 | 9.519 |
| 5.79985 | 9.436 |
| 5.80232 | 9.355 |
| 5.80479 | 9.275 |
| 5.80726 | 9.195 |
| 5.809729999999999 | 9.118 |
| 5.812189999999999 | 9.04 |
| 5.81466 | 8.954 |
| 5.81713 | 8.862 |
| 5.8196 | 8.769 |
| 5.82207 | 8.656 |
| 5.82454 | 8.542 |
| 5.8270100000000005 | 8.431 |
| 5.829479999999999 | 8.331 |
| 5.83195 | 8.231 |
| 5.83442 | 8.146 |
| 5.83689 | 8.071 |
| 5.8393500000000005 | 7.995 |
| 5.841819999999999 | 7.926 |
| 5.84429 | 7.858 |
| 5.846760000000001 | 7.788 |
| 5.8492299999999995 | 7.716 |
| 5.8517 | 7.643 |
| 5.85417 | 7.565 |
| 5.8566400000000005 | 7.484 |
| 5.859109999999999 | 7.403 |
| 5.86158 | 7.319 |
| 5.86405 | 7.235 |
| 5.86651 | 7.153 |
| 5.86898 | 7.078 |
| 5.871449999999999 | 7.002 |
| 5.87392 | 6.924 |
| 5.876390000000001 | 6.844 |
| 5.8788599999999995 | 6.764 |
| 5.88133 | 6.672 |
| 5.8838 | 6.578 |
| 5.886270000000001 | 6.484 |
| 5.888739999999999 | 6.393 |
| 5.8911999999999995 | 6.302 |
| 5.89367 | 6.215 |
| 5.89614 | 6.134 |
| 5.89861 | 6.052 |
| 5.90108 | 5.979 |
| 5.90355 | 5.909 |
| 5.906020000000001 | 5.839 |
| 5.90849 | 5.777 |
| 5.91096 | 5.715 |
| 5.91343 | 5.653 |
| 5.9159 | 5.59 |
| 5.91836 | 5.527 |
| 5.92083 | 5.464 |
| 5.9233 | 5.4 |
| 5.925770000000001 | 5.337 |
| 5.92824 | 5.265 |
| 5.93071 | 5.192 |
| 5.93318 | 5.117 |
| 5.93565 | 5.021 |
| 5.93812 | 4.925 |
| 5.94059 | 4.831 |
| 5.94306 | 4.744 |
| 5.94552 | 4.657 |
| 5.94799 | 4.584 |
| 5.95046 | 4.523 |
| 5.95293 | 4.461 |
| 5.9554 | 4.402 |
| 5.95787 | 4.344 |
| 5.96034 | 4.286 |
| 5.96281 | 4.217 |
| 5.96528 | 4.149 |
| 5.96775 | 4.078 |
| 5.97022 | 4.002 |
| 5.97268 | 3.926 |
| 5.975149999999999 | 3.851 |
| 5.97762 | 3.777 |
| 5.980090000000001 | 3.703 |
| 5.98256 | 3.624 |
| 5.98503 | 3.543 |
| 5.9875 | 3.462 |
| 5.9899700000000005 | 3.377 |
| 5.992439999999999 | 3.292 |
| 5.99491 | 3.207 |
| 5.99737 | 3.136 |
| 5.99984 | 3.066 |
| 6.0023100000000005 | 2.996 |
| 6.004779999999999 | 2.93 |
| 6.00725 | 2.864 |
| 6.009720000000001 | 2.794 |
| 6.0121899999999995 | 2.717 |
| 6.01466 | 2.64 |
| 6.01713 | 2.563 |
| 6.0196000000000005 | 2.486 |
| 6.022069999999999 | 2.409 |
| 6.0245299999999995 | 2.344 |
| 6.027 | 2.283 |
| 6.02947 | 2.222 |
| 6.03194 | 2.171 |
| 6.03441 | 2.121 |
| 6.03688 | 2.071 |
| 6.039350000000001 | 2.012 |
| 6.0418199999999995 | 1.953 |
| 6.04429 | 1.888 |
| 6.04676 | 1.804 |
| 6.04923 | 1.72 |
| 6.05169 | 1.642 |
| 6.0541599999999995 | 1.574 |
| 6.05663 | 1.506 |
| 6.0591 | 1.453 |
| 6.06157 | 1.413 |
| 6.06404 | 1.373 |
| 6.06651 | 1.33 |
| 6.06898 | 1.287 |
| 6.07145 | 1.243 |
| 6.07392 | 1.197 |
| 6.07639 | 1.15 |
| 6.07885 | 1.103 |
| 6.08132 | 1.066 |
| 6.08379 | 1.031 |
| 6.08626 | 0.996 |
| 6.08873 | 0.968 |
| 6.0912 | 0.941 |
| 6.09367 | 0.914 |
| 6.09614 | 0.889 |
| 6.09861 | 0.864 |
| 6.10108 | 0.838 |
| 6.10355 | 0.811 |
| 6.10601 | 0.784 |
| 6.108479999999999 | 0.755 |
| 6.11095 | 0.723 |
| 6.11342 | 0.692 |
| 6.11589 | 0.663 |
| 6.11836 | 0.637 |
| 6.12083 | 0.611 |
| 6.1233 | 0.589 |
| 6.12577 | 0.573 |
| 6.12824 | 0.556 |
| 6.1307 | 0.54 |
| 6.13317 | 0.526 |
| 6.13564 | 0.511 |
| 6.138109999999999 | 0.496 |
| 6.14058 | 0.48 |
| 6.143050000000001 | 0.465 |
| 6.14552 | 0.449 |
| 6.14799 | 0.434 |
| 6.15046 | 0.419 |
| 6.1529300000000005 | 0.404 |
| 6.155399999999999 | 0.389 |
| 6.1578599999999994 | 0.374 |
| 6.16033 | 0.36 |
| 6.1628 | 0.346 |
| 6.1652700000000005 | 0.333 |
| 6.16774 | 0.321 |
| 6.17021 | 0.31 |
| 6.172680000000001 | 0.299 |
| 6.1751499999999995 | 0.29 |
| 6.17762 | 0.28 |
| 6.18009 | 0.27 |
| 6.1825600000000005 | 0.26 |
| 6.185020000000001 | 0.249 |
| 6.1874899999999995 | 0.238 |
| 6.18996 | 0.229 |
| 6.19243 | 0.221 |
| 6.1949 | 0.212 |
| 6.19737 | 0.205 |
| 6.19984 | 0.199 |
| 6.202310000000001 | 0.193 |
| 6.2047799999999995 | 0.187 |
| 6.20725 | 0.18 |
| 6.20972 | 0.174 |
| 6.21218 | 0.168 |
| 6.21465 | 0.161 |
| 6.2171199999999995 | 0.154 |
| 6.21959 | 0.147 |
| 6.222060000000001 | 0.141 |
| 6.22453 | 0.134 |
| 6.227 | 0.128 |
| 6.22947 | 0.122 |
| 6.23194 | 0.117 |
| 6.23441 | 0.112 |
| 6.23687 | 0.107 |
| 6.23934 | 0.102 |
| 6.24181 | 0.098 |
| 6.24428 | 0.094 |
| 6.24675 | 0.091 |
| 6.24922 | 0.087 |
| 6.25169 | 0.085 |
| 6.25416 | 0.082 |
| 6.25663 | 0.079 |
| 6.2591 | 0.076 |
| 6.26157 | 0.073 |
| 6.26403 | 0.07 |
| 6.2665 | 0.067 |
| 6.26897 | 0.064 |
| 6.271439999999999 | 0.061 |
| 6.27391 | 0.058 |
| 6.2763800000000005 | 0.055 |
| 6.27885 | 0.052 |
| 6.28132 | 0.049 |
| 6.28379 | 0.047 |
| 6.28626 | 0.044 |
| 6.288729999999999 | 0.041 |
| 6.291189999999999 | 0.038 |
| 6.29366 | 0.036 |
| 6.29613 | 0.033 |
| 6.2986 | 0.031 |
| 6.301069999999999 | 0.029 |
| 6.30354 | 0.027 |
| 6.306010000000001 | 0.025 |
| 6.308479999999999 | 0.023 |
| 6.31095 | 0.021 |
| 6.31342 | 0.02 |
| 6.3158900000000004 | 0.019 |
| 6.318350000000001 | 0.018 |
| 6.320819999999999 | 0.018 |
| 6.32329 | 0.017 |
| 6.32576 | 0.017 |
| 6.32823 | 0.016 |
| 6.3307 | 0.016 |
| 6.33317 | 0.015 |
| 6.335640000000001 | 0.014 |
| 6.3381099999999995 | 0.013 |
| 6.34058 | 0.012 |
| 6.34305 | 0.011 |
| 6.34551 | 0.01 |
| 6.34798 | 0.009 |
| 6.3504499999999995 | 0.008 |
| 6.35292 | 0.007 |
| 6.355390000000001 | 0.007 |
| 6.35786 | 0.005 |
| 6.36033 | 0.004 |
| 6.3628 | 0.003 |
| 6.365270000000001 | 0.002 |
| 6.3677399999999995 | 0.001 |
| 6.3702 | 0 |
| 6.37267 | 0 |
| 6.37514 | 0 |
| 6.37761 | 0 |
| 6.3800799999999995 | 0 |
| 6.38255 | 0 |
| 6.385020000000001 | 0 |
| 6.38749 | 0 |
| 6.38996 | 0 |
| 6.39243 | 0 |
| 6.3949 | 0 |
| 6.39736 | 0 |
| 6.39983 | 0 |
| 6.4023 | 0 |
| 6.40477 | 0 |
| 6.40724 | 0 |
| 6.4097100000000005 | 0 |
| 6.41218 | 0 |
| 6.41465 | 0 |
| 6.41712 | 0 |
| 6.41959 | 0 |
| 6.42206 | 0 |
| 6.42452 | 0 |
| 6.42699 | 0 |
| 6.42946 | 0 |
| 6.43193 | 0 |
| 6.434399999999999 | 0 |
| 6.43687 | 0 |
| 6.4393400000000005 | 0 |
| 6.44181 | 0 |
| 6.44428 | 0 |
| 6.44675 | 0 |
| 6.44922 | 0 |
| 6.4516800000000005 | 0 |
| 6.454149999999999 | 0 |
| 6.45662 | 0 |
| 6.45909 | 0 |
| 6.46156 | 0 |
| 6.46403 | 0 |
| 6.4665 | 0 |
| 6.4689700000000006 | 0 |
| 6.471439999999999 | 0 |
| 6.47391 | 0 |
| 6.47637 | 0 |
| 6.47884 | 0 |
| 6.481310000000001 | 0 |
| 6.483779999999999 | 0 |
| 6.48625 | 0 |
| 6.48872 | 0 |
| 6.49119 | 0 |
| 6.49366 | 0 |
| 6.49613 | 0 |
| 6.498600000000001 | 0 |
| 6.5010699999999995 | 0 |
| 6.50353 | 0 |
| 6.506 | 0 |
| 6.50847 | 0.001 |
| 6.51094 | 0.002 |
| 6.5134099999999995 | 0.003 |
| 6.51588 | 0.005 |
| 6.518350000000001 | 0.007 |
| 6.52082 | 0.008 |
| 6.52329 | 0.009 |
| 6.52576 | 0.009 |
| 6.52823 | 0.009 |
| 6.53069 | 0.009 |
| 6.53316 | 0.008 |
| 6.53563 | 0.006 |
| 6.5381 | 0.005 |
| 6.54057 | 0.003 |
| 6.5430399999999995 | 0.002 |
| 6.54551 | 0.001 |
| 6.54798 | 0 |
| 6.55045 | 0 |
| 6.55292 | 0 |
| 6.55539 | 0 |
| 6.55785 | 0 |
| 6.56032 | 0 |
| 6.56279 | 0 |
| 6.56526 | 0 |
| 6.567729999999999 | 0 |
| 6.5702 | 0 |
| 6.5726700000000005 | 0 |
| 6.57514 | 0 |
| 6.57761 | 0 |
| 6.58008 | 0 |
| 6.58254 | 0 |
| 6.5850100000000005 | 0 |
| 6.587479999999999 | 0 |
| 6.58995 | 0 |
| 6.59242 | 0 |
| 6.59489 | 0 |
| 6.59736 | 0 |
| 6.59983 | 0 |
| 6.6023000000000005 | 0 |
| 6.60477 | 0 |
| 6.60724 | 0 |
| 6.6097 | 0 |
| 6.61217 | 0 |
| 6.6146400000000005 | 0 |
| 6.617109999999999 | 0 |
| 6.61958 | 0 |
| 6.62205 | 0 |
| 6.62452 | 0 |
| 6.62699 | 0 |
| 6.62946 | 0 |
| 6.6319300000000005 | 0 |
| 6.634399999999999 | 0 |
| 6.6368599999999995 | 0 |
| 6.63933 | 0 |
| 6.6418 | 0 |
| 6.644270000000001 | 0 |
| 6.646739999999999 | 0 |
| 6.64921 | 0 |
| 6.651680000000001 | 0 |
| 6.65415 | 0 |
| 6.65662 | 0 |
| 6.65909 | 0 |
| 6.661560000000001 | 0 |
| 6.664020000000001 | 0 |
| 6.66649 | 0 |
| 6.66896 | 0 |
| 6.67143 | 0 |
| 6.6739 | 0 |
| 6.6763699999999995 | 0 |
| 6.67884 | 0 |
| 6.681310000000001 | 0 |
| 6.68378 | 0 |
| 6.68625 | 0 |
| 6.68872 | 0 |
| 6.69118 | 0 |
| 6.69365 | 0 |
| 6.69612 | 0 |
| 6.69859 | 0 |
| 6.70106 | 0 |
| 6.70353 | 0 |
| 6.706 | 0 |
| 6.70847 | 0 |
| 6.71094 | 0 |
| 6.71341 | 0 |
| 6.71587 | 0 |
| 6.71834 | 0 |
| 6.72081 | 0 |
| 6.72328 | 0 |
| 6.72575 | 0 |
| 6.72822 | 0 |
| 6.730689999999999 | 0 |
| 6.73316 | 0 |
| 6.7356300000000005 | 0 |
| 6.7381 | 0 |
| 6.74057 | 0 |
| 6.74303 | 0 |
| 6.7455 | 0 |
| 6.7479700000000005 | 0 |
| 6.750439999999999 | 0 |
| 6.75291 | 0 |
| 6.75538 | 0 |
| 6.75785 | 0 |
| 6.76032 | 0 |
| 6.76279 | 0 |
| 6.7652600000000005 | 0 |
| 6.767729999999999 | 0 |
| 6.7701899999999995 | 0 |
| 6.77266 | 0 |
| 6.77513 | 0 |
| 6.7776000000000005 | 0 |
| 6.780069999999999 | 0 |
| 6.78254 | 0 |
| 6.785010000000001 | 0 |
| 6.7874799999999995 | 0 |
| 6.78995 | 0 |
| 6.79242 | 0 |
| 6.7948900000000005 | 0 |
| 6.797350000000001 | 0 |
| 6.7998199999999995 | 0 |
| 6.80229 | 0 |
| 6.80476 | 0 |
| 6.80723 | 0 |
| 6.809699999999999 | 0 |
| 6.81217 | 0 |
| 6.814640000000001 | 0 |
| 6.81711 | 0 |
| 6.81958 | 0 |
| 6.82204 | 0 |
| 6.82451 | 0 |
| 6.82698 | 0 |
| 6.82945 | 0 |
| 6.83192 | 0 |
| 6.83439 | 0 |
| 6.83686 | 0 |
| 6.83933 | 0 |
| 6.8418 | 0 |
| 6.844270000000001 | 0 |
| 6.84674 | 0 |
| 6.8492 | 0 |
| 6.85167 | 0 |
| 6.85414 | 0 |
| 6.85661 | 0 |
| 6.85908 | 0 |
| 6.86155 | 0 |
| 6.86402 | 0 |
| 6.86649 | 0 |
| 6.86896 | 0 |
| 6.87143 | 0 |
| 6.8739 | 0 |
| 6.87636 | 0 |
| 6.87883 | 0 |
| 6.8813 | 0 |
| 6.88377 | 0 |
| 6.88624 | 0 |
| 6.88871 | 0 |
| 6.89118 | 0 |
| 6.89365 | 0 |
| 6.89612 | 0 |
| 6.89859 | 0 |
| 6.90106 | 0 |
| 6.90352 | 0 |
| 6.90599 | 0 |
| 6.90846 | 0 |
| 6.9109300000000005 | 0 |
| 6.913399999999999 | 0 |
| 6.91587 | 0 |
| 6.91834 | 0 |
| 6.92081 | 0 |
| 6.92328 | 0 |
| 6.92575 | 0 |
| 6.9282200000000005 | 0 |
| 6.930680000000001 | 0 |
| 6.9331499999999995 | 0 |
| 6.93562 | 0 |
| 6.93809 | 0 |
| 6.9405600000000005 | 0 |
| 6.943029999999999 | 0 |
| 6.9455 | 0 |
| 6.947970000000001 | 0 |
| 6.9504399999999995 | 0 |
| 6.95291 | 0 |
| 6.95537 | 0 |
| 6.95784 | 0 |
| 6.960310000000001 | 0 |
| 6.9627799999999995 | 0 |
| 6.96525 | 0 |
| 6.96772 | 0 |
| 6.97019 | 0 |
| 6.972659999999999 | 0 |
| 6.97513 | 0 |
| 6.977600000000001 | 0 |
| 6.9800699999999996 | 0 |
| 6.98253 | 0 |
| 6.985 | 0 |
| 6.98747 | 0 |
| 6.98994 | 0 |
| 6.99241 | 0 |
| 6.99488 | 0 |
| 6.99735 | 0 |
| 6.99982 | 0 |
| 7.00229 | 0 |
| 7.00476 | 0 |
| 7.00723 | 0 |
| 7.00969 | 0 |
| 7.01216 | 0 |
| 7.01463 | 0 |
| 7.0171 | 0 |
| 7.01957 | 0 |
| 7.02204 | 0 |
| 7.02451 | 0 |
| 7.02698 | 0 |
| 7.02945 | 0 |
| 7.03192 | 0 |
| 7.03439 | 0 |
| 7.03685 | 0 |
| 7.03932 | 0 |
| 7.04179 | 0 |
| 7.04426 | 0 |
| 7.046729999999999 | 0 |
| 7.0492 | 0 |
| 7.05167 | 0 |
| 7.05414 | 0 |
| 7.05661 | 0 |
| 7.05908 | 0 |
| 7.06154 | 0 |
| 7.064010000000001 | 0 |
| 7.066479999999999 | 0 |
| 7.06895 | 0 |
| 7.07142 | 0 |
| 7.0738900000000005 | 0 |
| 7.076359999999999 | 0 |
| 7.07883 | 0 |
| 7.081300000000001 | 0 |
| 7.08377 | 0 |
| 7.08624 | 0 |
| 7.0887 | 0 |
| 7.09117 | 0 |
| 7.093640000000001 | 0 |
| 7.0961099999999995 | 0 |
| 7.09858 | 0 |
| 7.10105 | 0 |
| 7.1035200000000005 | 0 |
| 7.105989999999999 | 0 |
| 7.10846 | 0 |
| 7.110930000000001 | 0 |
| 7.1133999999999995 | 0 |
| 7.11586 | 0 |
| 7.11833 | 0 |
| 7.1208 | 0 |
| 7.123270000000001 | 0 |
| 7.1257399999999995 | 0 |
| 7.12821 | 0 |
| 7.13068 | 0 |
| 7.13315 | 0 |
| 7.13562 | 0.001 |
| 7.13809 | 0.002 |
| 7.140560000000001 | 0.003 |
| 7.143020000000001 | 0.004 |
| 7.14549 | 0.005 |
| 7.14796 | 0.007 |
| 7.15043 | 0.009 |
| 7.1529 | 0.01 |
| 7.15537 | 0.011 |
| 7.15784 | 0.011 |
| 7.160310000000001 | 0.012 |
| 7.16278 | 0.012 |
| 7.16525 | 0.012 |
| 7.1677100000000005 | 0.011 |
| 7.17018 | 0.011 |
| 7.17265 | 0.01 |
| 7.17512 | 0.009 |
| 7.17759 | 0.009 |
| 7.18006 | 0.008 |
| 7.18253 | 0.007 |
| 7.185 | 0.006 |
| 7.18747 | 0.005 |
| 7.18994 | 0.005 |
| 7.19241 | 0.004 |
| 7.19487 | 0.005 |
| 7.1973400000000005 | 0.005 |
| 7.19981 | 0.005 |
| 7.20228 | 0.005 |
| 7.20475 | 0.006 |
| 7.20722 | 0.007 |
| 7.209689999999999 | 0.008 |
| 7.21216 | 0.009 |
| 7.2146300000000005 | 0.009 |
| 7.2171 | 0.009 |
| 7.21957 | 0.009 |
| 7.22203 | 0.009 |
| 7.2245 | 0.007 |
| 7.226970000000001 | 0.004 |
| 7.229439999999999 | 0.002 |
| 7.23191 | 0 |
| 7.23438 | 0 |
| 7.2368500000000004 | 0 |
| 7.239319999999999 | 0 |
| 7.24179 | 0 |
| 7.244260000000001 | 0 |
| 7.2467299999999994 | 0 |
| 7.24919 | 0 |
| 7.25166 | 0 |
| 7.25413 | 0 |
| 7.256600000000001 | 0 |
| 7.2590699999999995 | 0 |
| 7.26154 | 0 |
| 7.26401 | 0 |
| 7.26648 | 0 |
| 7.26895 | 0 |
| 7.27142 | 0 |
| 7.273890000000001 | 0 |
| 7.276350000000001 | 0 |
| 7.27882 | 0 |
| 7.28129 | 0 |
| 7.28376 | 0 |
| 7.28623 | 0 |
| 7.2886999999999995 | 0 |
| 7.29117 | 0 |
| 7.29364 | 0 |
| 7.29611 | 0 |
| 7.29858 | 0 |
| 7.3010399999999995 | 0 |
| 7.30351 | 0 |
| 7.30598 | 0 |
| 7.30845 | 0 |
| 7.31092 | 0 |
| 7.31339 | 0 |
| 7.31586 | 0 |
| 7.31833 | 0 |
| 7.3208 | 0 |
| 7.323270000000001 | 0 |
| 7.32574 | 0 |
| 7.3282 | 0 |
| 7.3306700000000005 | 0 |
| 7.33314 | 0 |
| 7.33561 | 0 |
| 7.33808 | 0 |
| 7.34055 | 0 |
| 7.34302 | 0 |
| 7.34549 | 0 |
| 7.34796 | 0 |
| 7.35043 | 0 |
| 7.3529 | 0 |
| 7.355359999999999 | 0 |
| 7.35783 | 0 |
| 7.3603000000000005 | 0 |
| 7.36277 | 0 |
| 7.36524 | 0 |
| 7.36771 | 0 |
| 7.37018 | 0 |
| 7.372649999999999 | 0 |
| 7.37512 | 0 |
| 7.3775900000000005 | 0 |
| 7.38006 | 0 |
| 7.38252 | 0 |
| 7.38499 | 0 |
| 7.38746 | 0 |
| 7.3899300000000006 | 0 |
| 7.392399999999999 | 0 |
| 7.39487 | 0 |
| 7.39734 | 0 |
| 7.39981 | 0 |
| 7.402279999999999 | 0 |
| 7.40475 | 0 |
| 7.40721 | 0 |
| 7.409680000000001 | 0 |
| 7.41215 | 0 |
| 7.41462 | 0 |
| 7.41709 | 0 |
| 7.419560000000001 | 0 |
| 7.4220299999999995 | 0 |
| 7.4245 | 0 |
| 7.42697 | 0 |
| 7.42944 | 0 |
| 7.43191 | 0 |
| 7.4343699999999995 | 0 |
| 7.43684 | 0 |
| 7.439310000000001 | 0 |
| 7.44178 | 0 |
| 7.44425 | 0 |
| 7.44672 | 0 |
| 7.44919 | 0 |
| 7.4516599999999995 | 0 |
| 7.45413 | 0 |
| 7.456600000000001 | 0 |
| 7.45907 | 0 |
| 7.46153 | 0 |
| 7.464 | 0 |
| 7.46647 | 0 |
| 7.46894 | 0 |
| 7.47141 | 0 |
| 7.47388 | 0 |
| 7.47635 | 0 |
| 7.47882 | 0 |
| 7.4812899999999996 | 0 |
| 7.48376 | 0 |
| 7.48623 | 0 |
| 7.488689999999999 | 0 |
| 7.49116 | 0 |
| 7.4936300000000005 | 0 |
| 7.4961 | 0 |
| 7.49857 | 0 |
| 7.50104 | 0 |
| 7.50351 | 0 |
| 7.505979999999999 | 0 |
| 7.50845 | 0 |
| 7.5109200000000005 | 0 |
| 7.51338 | 0 |
| 7.51585 | 0 |
| 7.51832 | 0 |
| 7.52079 | 0 |
| 7.5232600000000005 | 0 |
| 7.525729999999999 | 0 |
| 7.5282 | 0 |
| 7.53067 | 0 |
| 7.53314 | 0 |
| 7.535609999999999 | 0 |
| 7.53808 | 0 |
| 7.54054 | 0 |
| 7.543010000000001 | 0 |
| 7.5454799999999995 | 0 |
| 7.54795 | 0 |
| 7.55042 | 0 |
| 7.5528900000000005 | 0 |
| 7.555359999999999 | 0 |
| 7.55783 | 0 |
| 7.5603 | 0 |
| 7.56277 | 0 |
| 7.56524 | 0 |
| 7.567699999999999 | 0 |
| 7.57017 | 0 |
| 7.572640000000001 | 0 |
| 7.57511 | 0 |
| 7.57758 | 0 |
| 7.58005 | 0 |
| 7.582520000000001 | 0 |
| 7.5849899999999995 | 0 |
| 7.58746 | 0 |
| 7.589930000000001 | 0 |
| 7.5924 | 0 |
| 7.59486 | 0 |
| 7.59733 | 0 |
| 7.5998 | 0 |
| 7.602270000000001 | 0 |
| 7.60474 | 0 |
| 7.60721 | 0 |
| 7.60968 | 0 |
| 7.61215 | 0 |
| 7.6146199999999995 | 0 |
| 7.61709 | 0 |
| 7.619560000000001 | 0 |
| 7.62202 | 0 |
| 7.62449 | 0 |
| 7.62696 | 0 |
| 7.62943 | 0 |
| 7.6319 | 0 |
| 7.63437 | 0 |
| 7.63684 | 0 |
| 7.63931 | 0 |
| 7.64178 | 0 |
| 7.64425 | 0 |
| 7.64671 | 0 |
| 7.64918 | 0 |
| 7.65165 | 0 |
| 7.65412 | 0 |
| 7.6565900000000005 | 0 |
| 7.65906 | 0 |
| 7.66153 | 0 |
| 7.664 | 0 |
| 7.66647 | 0 |
| 7.668939999999999 | 0 |
| 7.67141 | 0 |
| 7.67387 | 0 |
| 7.67634 | 0 |
| 7.67881 | 0 |
| 7.68128 | 0 |
| 7.68375 | 0 |
| 7.6862200000000005 | 0 |
| 7.688689999999999 | 0 |
| 7.69116 | 0 |
| 7.69363 | 0 |
| 7.6961 | 0 |
| 7.69857 | 0 |
| 7.701029999999999 | 0 |
| 7.7035 | 0 |
| 7.705970000000001 | 0 |
| 7.7084399999999995 | 0 |
| 7.71091 | 0 |
| 7.71338 | 0 |
| 7.7158500000000005 | 0 |
| 7.718319999999999 | 0 |
| 7.72079 | 0 |
| 7.72326 | 0 |
| 7.7257299999999995 | 0 |
| 7.72819 | 0 |
| 7.730659999999999 | 0 |
| 7.73313 | 0 |
| 7.735600000000001 | 0 |
| 7.73807 | 0 |
| 7.74054 | 0 |
| 7.74301 | 0 |
| 7.74548 | 0 |
| 7.7479499999999994 | 0 |
| 7.75042 | 0 |
| 7.75288 | 0 |
| 7.75535 | 0 |
| 7.75782 | 0 |
| 7.76029 | 0 |
| 7.76276 | 0 |
| 7.76523 | 0 |
| 7.7677 | 0 |
| 7.77017 | 0 |
| 7.77264 | 0 |
| 7.77511 | 0 |
| 7.7775799999999995 | 0 |
| 7.78004 | 0 |
| 7.78251 | 0 |
| 7.784979999999999 | 0 |
| 7.78745 | 0 |
| 7.78992 | 0 |
| 7.79239 | 0 |
| 7.79486 | 0 |
| 7.79733 | 0 |
| 7.7998 | 0 |
| 7.80227 | 0 |
| 7.80474 | 0 |
| 7.8072 | 0 |
| 7.80967 | 0 |
| 7.81214 | 0 |
| 7.81461 | 0 |
| 7.81708 | 0 |
| 7.8195500000000004 | 0 |
| 7.82202 | 0 |
| 7.82449 | 0 |
| 7.82696 | 0 |
| 7.82943 | 0 |
| 7.831899999999999 | 0 |
| 7.834359999999999 | 0 |
| 7.83683 | 0 |
| 7.839300000000001 | 0 |
| 7.84177 | 0 |
| 7.84424 | 0 |
| 7.84671 | 0 |
| 7.8491800000000005 | 0 |
| 7.851649999999999 | 0 |
| 7.85412 | 0 |
| 7.85659 | 0 |
| 7.85906 | 0 |
| 7.8615200000000005 | 0 |
| 7.863989999999999 | 0 |
| 7.86646 | 0 |
| 7.868930000000001 | 0 |
| 7.8713999999999995 | 0 |
| 7.87387 | 0 |
| 7.87634 | 0 |
| 7.8788100000000005 | 0 |
| 7.881279999999999 | 0 |
| 7.88375 | 0 |
| 7.88621 | 0 |
| 7.88868 | 0 |
| 7.89115 | 0 |
| 7.89362 | 0 |
| 7.89609 | 0 |
| 7.898560000000001 | 0 |
| 7.9010299999999996 | 0 |
| 7.9035 | 0 |
| 7.90597 | 0 |
| 7.90844 | 0 |
| 7.910909999999999 | 0 |
| 7.91337 | 0 |
| 7.91584 | 0 |
| 7.91831 | 0 |
| 7.92078 | 0 |
| 7.92325 | 0 |
| 7.92572 | 0 |
| 7.92819 | 0 |
| 7.93066 | 0 |
| 7.93313 | 0 |
| 7.9356 | 0 |
| 7.93807 | 0 |
| 7.94053 | 0 |
| 7.943 | 0 |
| 7.94547 | 0 |
| 7.94794 | 0 |
| 7.95041 | 0 |
| 7.95288 | 0 |
| 7.95535 | 0.001 |
| 7.95782 | 0.001 |
| 7.96029 | 0.002 |
| 7.96276 | 0.002 |
| 7.965229999999999 | 0.003 |
| 7.967689999999999 | 0.003 |
| 7.97016 | 0.003 |
| 7.9726300000000005 | 0.004 |
| 7.9751 | 0.004 |
| 7.97757 | 0.004 |
| 7.98004 | 0.004 |
| 7.98251 | 0.003 |
| 7.984979999999999 | 0.003 |
| 7.98745 | 0.003 |
| 7.98992 | 0.002 |
| 7.99238 | 0.002 |
| 7.9948500000000005 | 0.001 |
| 7.997319999999999 | 0.001 |
| 7.99979 | 0 |